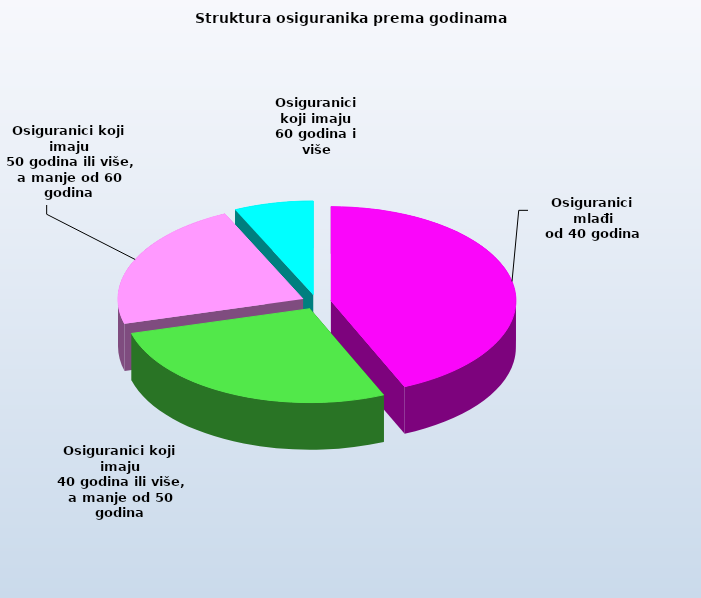
| Category | Series 0 |
|---|---|
| Osiguranici mlađi
od 40 godina | 684224 |
| Osiguranici koji imaju
 40 godina ili više, a manje od 50 godina | 429403 |
| Osiguranici koji imaju
 50 godina ili više, a manje od 60 godina | 351122 |
| Osiguranici koji imaju
60 godina i više | 109200 |